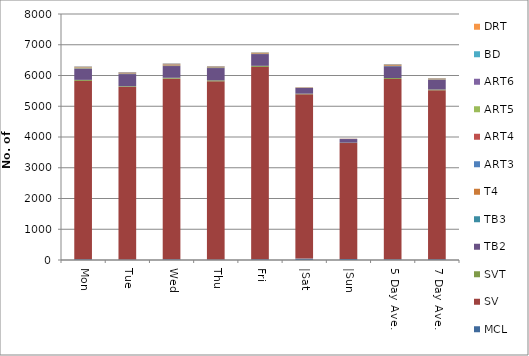
| Category | MCL | SV | SVT | TB2 | TB3 | T4 | ART3 | ART4 | ART5 | ART6 | BD | DRT |
|---|---|---|---|---|---|---|---|---|---|---|---|---|
| Mon | 25 | 5802 | 31 | 359 | 16 | 24 | 3 | 8 | 18 | 10 | 0 | 0 |
| Tue | 16 | 5613 | 22 | 395 | 15 | 17 | 2 | 9 | 13 | 11 | 1 | 1 |
| Wed | 23 | 5874 | 29 | 382 | 16 | 36 | 7 | 5 | 12 | 10 | 1 | 1 |
| Thu | 18 | 5793 | 31 | 400 | 19 | 21 | 5 | 7 | 8 | 6 | 1 | 0 |
| Fri | 27 | 6255 | 33 | 382 | 14 | 25 | 3 | 3 | 9 | 5 | 0 | 1 |
| |Sat | 45 | 5344 | 20 | 185 | 4 | 10 | 3 | 5 | 3 | 0 | 0 | 0 |
| |Sun | 35 | 3768 | 12 | 119 | 1 | 6 | 3 | 2 | 1 | 0 | 0 | 1 |
| 5 Day Ave. | 22 | 5867 | 29 | 384 | 16 | 25 | 4 | 6 | 12 | 8 | 1 | 1 |
| 7 Day Ave. | 27 | 5493 | 25 | 317 | 12 | 20 | 4 | 6 | 9 | 6 | 0 | 1 |